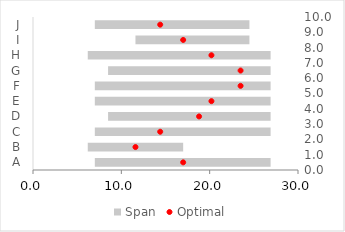
| Category | Low | Span |
|---|---|---|
| A | 7 | 19.9 |
| B | 6.2 | 10.8 |
| C | 7 | 19.9 |
| D | 8.5 | 18.4 |
| E | 7 | 19.9 |
| F | 7 | 19.9 |
| G | 8.5 | 18.4 |
| H | 6.2 | 20.7 |
| I | 11.6 | 12.9 |
| J | 7 | 17.5 |